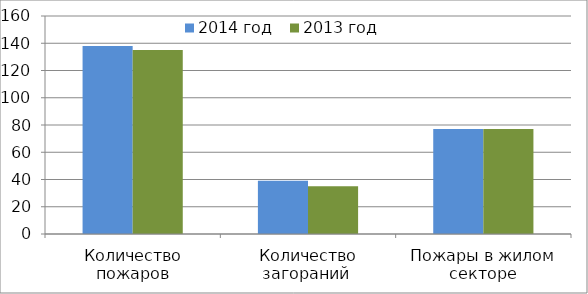
| Category | 2014 год | 2013 год |
|---|---|---|
| Количество пожаров | 138 | 135 |
| Количество загораний  | 39 | 35 |
| Пожары в жилом секторе | 77 | 77 |